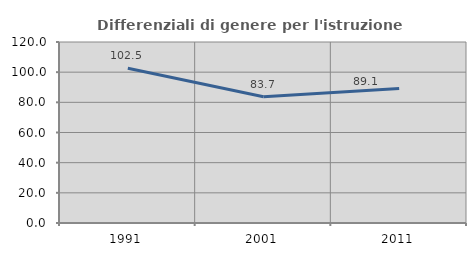
| Category | Differenziali di genere per l'istruzione superiore |
|---|---|
| 1991.0 | 102.547 |
| 2001.0 | 83.716 |
| 2011.0 | 89.111 |